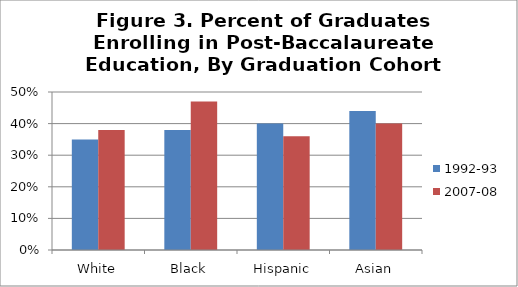
| Category | 1992-93 | 2007-08 |
|---|---|---|
| White | 0.35 | 0.38 |
| Black | 0.38 | 0.47 |
| Hispanic | 0.4 | 0.36 |
| Asian | 0.44 | 0.4 |